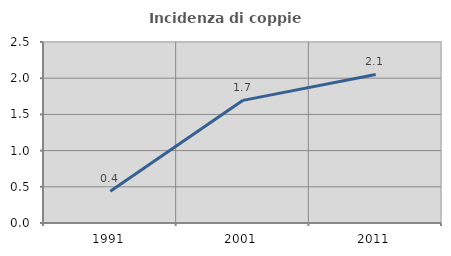
| Category | Incidenza di coppie miste |
|---|---|
| 1991.0 | 0.438 |
| 2001.0 | 1.694 |
| 2011.0 | 2.052 |